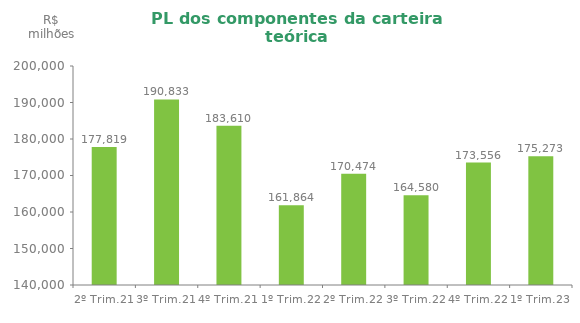
| Category | Series 0 |
|---|---|
| 2º Trim.21 | 177819.2 |
| 3º Trim.21 | 190833.2 |
| 4º Trim.21 | 183610.486 |
| 1º Trim.22 | 161864.31 |
| 2º Trim.22 | 170474.192 |
| 3º Trim.22 | 164580 |
| 4º Trim.22 | 173556 |
| 1º Trim.23 | 175273 |